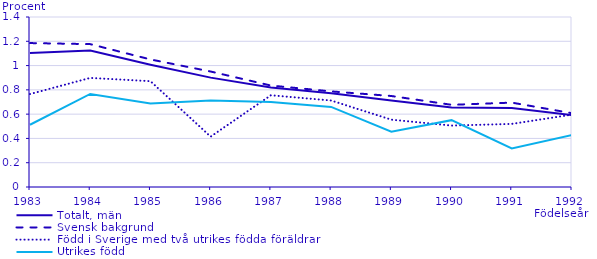
| Category | Totalt, män | Svensk bakgrund | Född i Sverige med två utrikes födda föräldrar | Utrikes född |
|---|---|---|---|---|
| 1983 | 1.104 | 1.185 | 0.765 | 0.513 |
| 1984 | 1.123 | 1.177 | 0.898 | 0.766 |
| 1985 | 1.007 | 1.05 | 0.871 | 0.687 |
| 1986 | 0.901 | 0.951 | 0.415 | 0.713 |
| 1987 | 0.82 | 0.836 | 0.756 | 0.7 |
| 1988 | 0.772 | 0.787 | 0.712 | 0.66 |
| 1989 | 0.713 | 0.749 | 0.554 | 0.455 |
| 1990 | 0.655 | 0.677 | 0.506 | 0.55 |
| 1991 | 0.651 | 0.695 | 0.52 | 0.317 |
| 1992 | 0.592 | 0.608 | 0.596 | 0.428 |